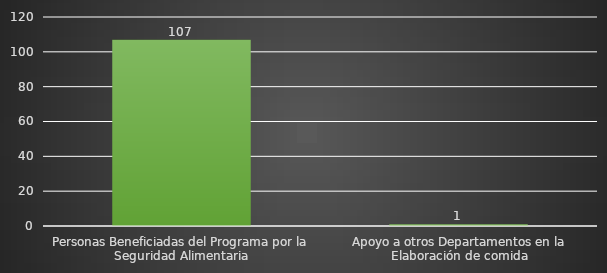
| Category | INDICADOR  |
|---|---|
| Personas Beneficiadas del Programa por la Seguridad Alimentaria | 107 |
| Apoyo a otros Departamentos en la Elaboración de comida | 1 |